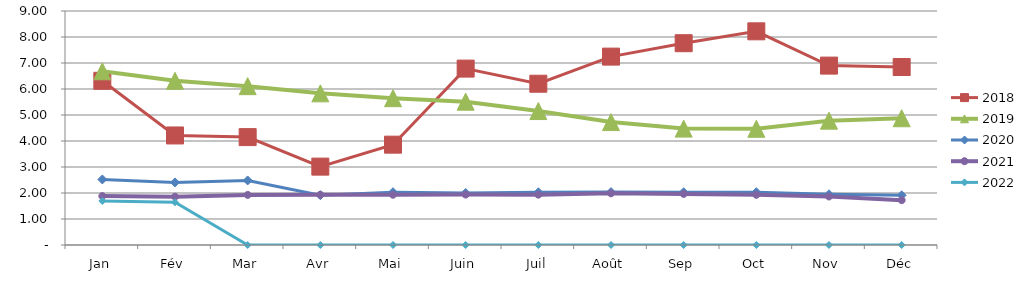
| Category | 2018 | 2019 | 2020 | 2021 | 2022 |
|---|---|---|---|---|---|
| Jan | 6.315 | 6.68 | 2.521 | 1.881 | 1.692 |
| Fév | 4.213 | 6.315 | 2.407 | 1.859 | 1.644 |
| Mar | 4.15 | 6.109 | 2.483 | 1.927 | 0 |
| Avr | 3.014 | 5.832 | 1.915 | 1.933 | 0 |
| Mai | 3.859 | 5.648 | 2.029 | 1.933 | 0 |
| Juin | 6.784 | 5.512 | 2.001 | 1.94 | 0 |
| Juil | 6.203 | 5.152 | 2.027 | 1.937 | 0 |
| Août | 7.245 | 4.728 | 2.036 | 1.987 | 0 |
| Sep | 7.761 | 4.477 | 2.029 | 1.965 | 0 |
| Oct | 8.218 | 4.47 | 2.032 | 1.931 | 0 |
| Nov | 6.9 | 4.782 | 1.95 | 1.865 | 0 |
| Déc | 6.846 | 4.875 | 1.91 | 1.725 | 0 |